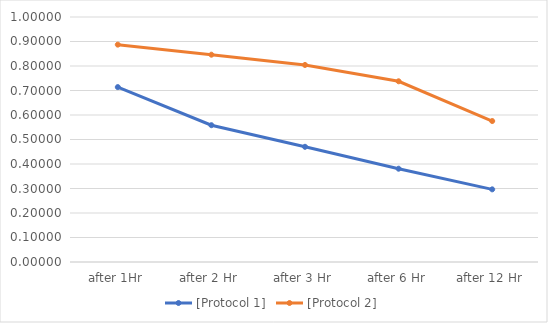
| Category | [Protocol 1] | [Protocol 2] |
|---|---|---|
| after 1Hr | 0.714 | 0.887 |
| after 2 Hr | 0.558 | 0.846 |
| after 3 Hr | 0.47 | 0.804 |
| after 6 Hr | 0.381 | 0.738 |
| after 12 Hr | 0.297 | 0.575 |